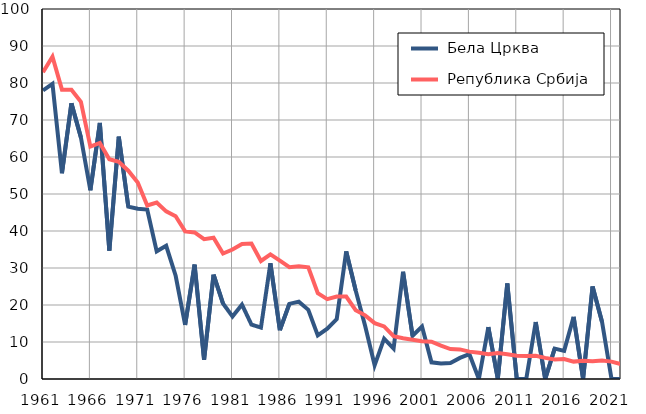
| Category |  Бела Црква |  Република Србија |
|---|---|---|
| 1961.0 | 78 | 82.9 |
| 1962.0 | 79.8 | 87.1 |
| 1963.0 | 55.6 | 78.2 |
| 1964.0 | 74.5 | 78.2 |
| 1965.0 | 65.3 | 74.9 |
| 1966.0 | 51 | 62.8 |
| 1967.0 | 69.2 | 63.8 |
| 1968.0 | 34.7 | 59.4 |
| 1969.0 | 65.5 | 58.7 |
| 1970.0 | 46.6 | 56.3 |
| 1971.0 | 46 | 53.1 |
| 1972.0 | 45.8 | 46.9 |
| 1973.0 | 34.5 | 47.7 |
| 1974.0 | 36 | 45.3 |
| 1975.0 | 27.9 | 44 |
| 1976.0 | 14.6 | 39.9 |
| 1977.0 | 30.9 | 39.6 |
| 1978.0 | 5.2 | 37.8 |
| 1979.0 | 28.2 | 38.2 |
| 1980.0 | 20.4 | 33.9 |
| 1981.0 | 16.9 | 35 |
| 1982.0 | 20.1 | 36.5 |
| 1983.0 | 14.7 | 36.6 |
| 1984.0 | 13.9 | 31.9 |
| 1985.0 | 31.3 | 33.7 |
| 1986.0 | 13.2 | 32 |
| 1987.0 | 20.3 | 30.2 |
| 1988.0 | 20.9 | 30.5 |
| 1989.0 | 18.7 | 30.2 |
| 1990.0 | 11.8 | 23.2 |
| 1991.0 | 13.6 | 21.6 |
| 1992.0 | 16.2 | 22.3 |
| 1993.0 | 34.5 | 22.3 |
| 1994.0 | 23.9 | 18.6 |
| 1995.0 | 14.3 | 17.2 |
| 1996.0 | 3.7 | 15.1 |
| 1997.0 | 10.9 | 14.2 |
| 1998.0 | 8.2 | 11.6 |
| 1999.0 | 29 | 11 |
| 2000.0 | 11.7 | 10.6 |
| 2001.0 | 14.2 | 10.2 |
| 2002.0 | 4.5 | 10.1 |
| 2003.0 | 4.2 | 9 |
| 2004.0 | 4.3 | 8.1 |
| 2005.0 | 5.7 | 8 |
| 2006.0 | 6.7 | 7.4 |
| 2007.0 | 0 | 7.1 |
| 2008.0 | 14 | 6.7 |
| 2009.0 | 0 | 7 |
| 2010.0 | 25.8 | 6.7 |
| 2011.0 | 0 | 6.3 |
| 2012.0 | 0 | 6.2 |
| 2013.0 | 15.4 | 6.3 |
| 2014.0 | 0 | 5.7 |
| 2015.0 | 8.2 | 5.3 |
| 2016.0 | 7.6 | 5.4 |
| 2017.0 | 16.8 | 4.7 |
| 2018.0 | 0 | 4.9 |
| 2019.0 | 25 | 4.8 |
| 2020.0 | 15.4 | 5 |
| 2021.0 | 0 | 4.7 |
| 2022.0 | 0 | 4 |